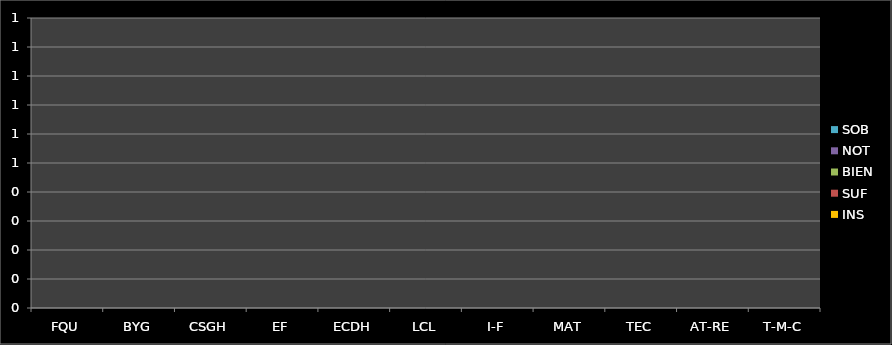
| Category | INS | SUF | BIEN | NOT | SOB |
|---|---|---|---|---|---|
| FQU | 0 | 0 | 0 | 0 | 0 |
| BYG | 0 | 0 | 0 | 0 | 0 |
| CSGH | 0 | 0 | 0 | 0 | 0 |
| EF | 0 | 0 | 0 | 0 | 0 |
| ECDH | 0 | 0 | 0 | 0 | 0 |
| LCL | 0 | 0 | 0 | 0 | 0 |
| I-F | 0 | 0 | 0 | 0 | 0 |
| MAT | 0 | 0 | 0 | 0 | 0 |
| TEC | 0 | 0 | 0 | 0 | 0 |
| AT-RE | 0 | 0 | 0 | 0 | 0 |
| T-M-C | 0 | 0 | 0 | 0 | 0 |